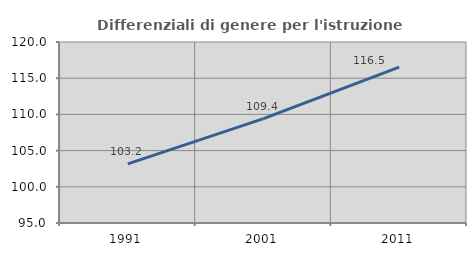
| Category | Differenziali di genere per l'istruzione superiore |
|---|---|
| 1991.0 | 103.164 |
| 2001.0 | 109.414 |
| 2011.0 | 116.533 |